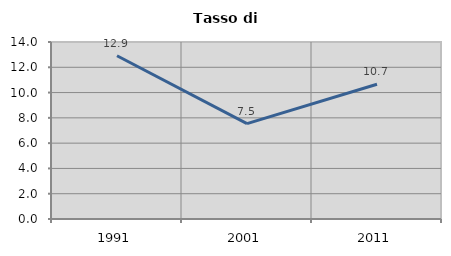
| Category | Tasso di disoccupazione   |
|---|---|
| 1991.0 | 12.915 |
| 2001.0 | 7.546 |
| 2011.0 | 10.655 |